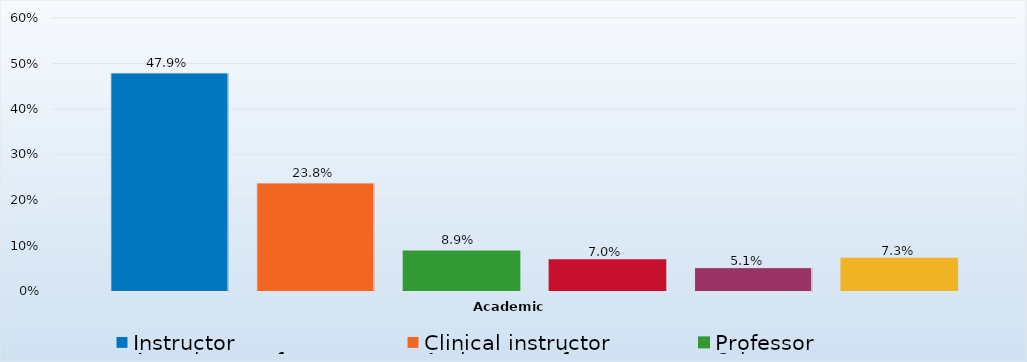
| Category | Instructor | Clinical instructor | Professor | Associate professor | Assistant professor | Other |
|---|---|---|---|---|---|---|
| 0 | 0.479 | 0.238 | 0.089 | 0.07 | 0.051 | 0.073 |